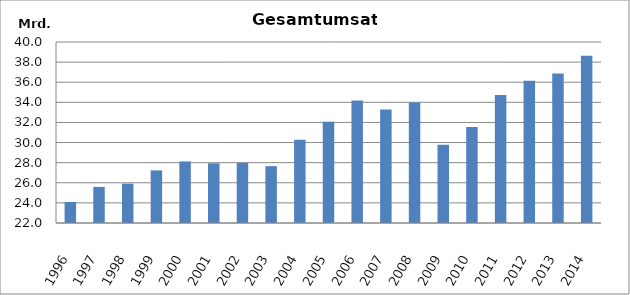
| Category | Umsatz |
|---|---|
| 1996.0 | 24088396 |
| 1997.0 | 25588482 |
| 1998.0 | 25911875 |
| 1999.0 | 27231996 |
| 2000.0 | 28121089 |
| 2001.0 | 27932719 |
| 2002.0 | 27976228 |
| 2003.0 | 27652647 |
| 2004.0 | 30278000 |
| 2005.0 | 32080721 |
| 2006.0 | 34189922 |
| 2007.0 | 33278221 |
| 2008.0 | 33993013 |
| 2009.0 | 29783049 |
| 2010.0 | 31557474.731 |
| 2011.0 | 34741088 |
| 2012.0 | 36149532.004 |
| 2013.0 | 36865319.524 |
| 2014.0 | 38623232.674 |